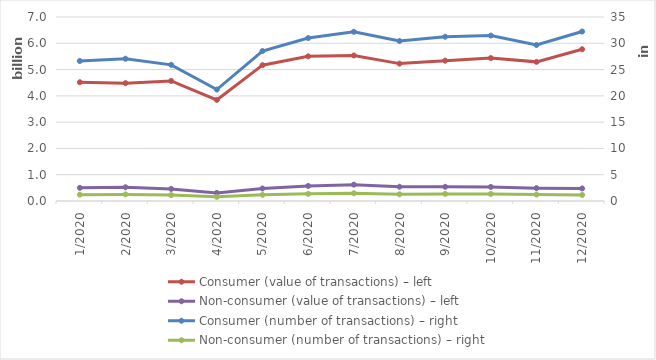
| Category | Consumer (value of transactions) – left | Non-consumer (value of transactions) – left |
|---|---|---|
| 1/2020 | 4517900633 | 500827305 |
| 2/2020 | 4481519468 | 522852826 |
| 3/2020 | 4566613170 | 459345498 |
| 4/2020 | 3845805534 | 307858851 |
| 5/2020 | 5167323625 | 476623487 |
| 6/2020 | 5504068731 | 571173073 |
| 7/2020 | 5536338586 | 622854610 |
| 8/2020 | 5226619434 | 542038442 |
| 9/2020 | 5337793573 | 538931259 |
| 10/2020 | 5437906480 | 536644045 |
| 11/2020 | 5293357248 | 487956821 |
| 12/2020 | 5772951224 | 477561138 |